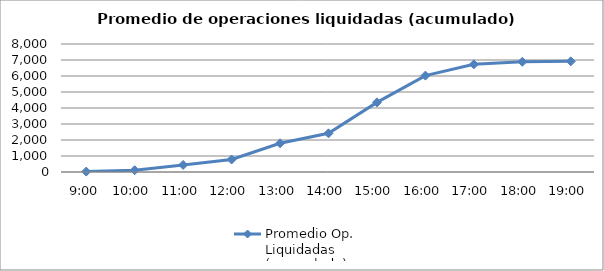
| Category | Promedio Op.
Liquidadas 
(acumulado) |
|---|---|
| 0.375 | 25.882 |
| 0.4166666666666667 | 112.706 |
| 0.4583333333333333 | 442.059 |
| 0.5 | 781.588 |
| 0.5416666666666666 | 1795 |
| 0.583333333333333 | 2418 |
| 0.625 | 4350.118 |
| 0.666666666666667 | 6024.529 |
| 0.708333333333333 | 6727.824 |
| 0.75 | 6888.588 |
| 0.791666666666667 | 6916.824 |